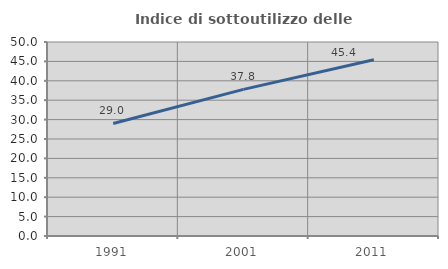
| Category | Indice di sottoutilizzo delle abitazioni  |
|---|---|
| 1991.0 | 29.012 |
| 2001.0 | 37.786 |
| 2011.0 | 45.439 |